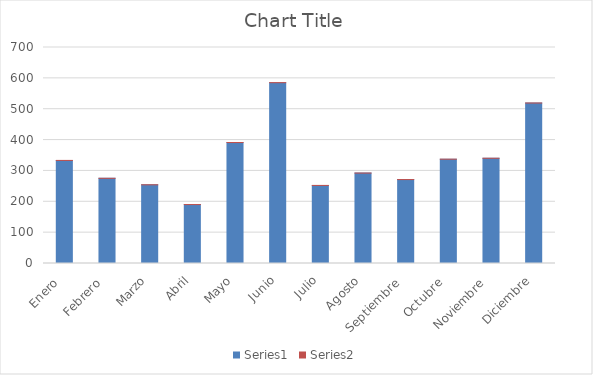
| Category | Series 0 | Series 1 |
|---|---|---|
| Enero  | 334 | 0.082 |
| Febrero  | 276 | 0.068 |
| Marzo | 255 | 0.063 |
| Abril | 191 | 0.047 |
| Mayo | 392 | 0.097 |
| Junio | 586 | 0.145 |
| Julio | 253 | 0.062 |
| Agosto | 293 | 0.072 |
| Septiembre  | 272 | 0.067 |
| Octubre  | 338 | 0.083 |
| Noviembre  | 341 | 0.084 |
| Diciembre | 520 | 0.128 |